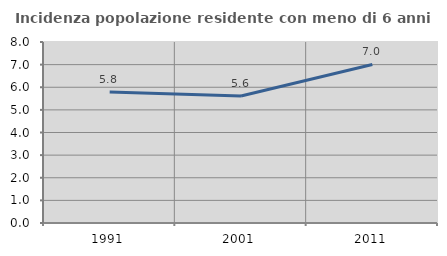
| Category | Incidenza popolazione residente con meno di 6 anni |
|---|---|
| 1991.0 | 5.786 |
| 2001.0 | 5.616 |
| 2011.0 | 7.009 |